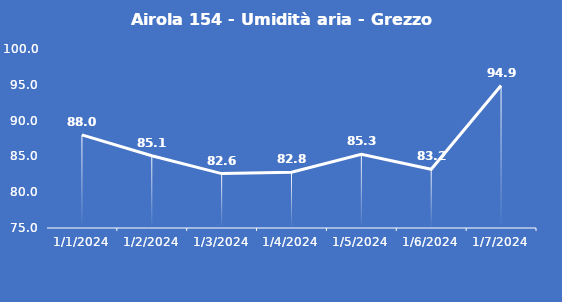
| Category | Airola 154 - Umidità aria - Grezzo (%) |
|---|---|
| 1/1/24 | 88 |
| 1/2/24 | 85.1 |
| 1/3/24 | 82.6 |
| 1/4/24 | 82.8 |
| 1/5/24 | 85.3 |
| 1/6/24 | 83.2 |
| 1/7/24 | 94.9 |